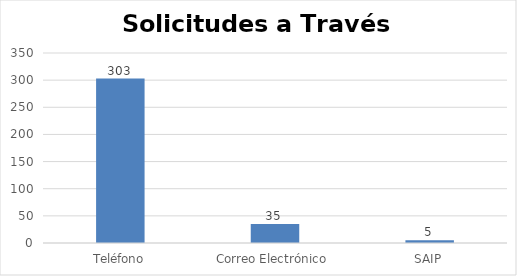
| Category | Cant. |
|---|---|
| Teléfono | 303 |
| Correo Electrónico  | 35 |
| SAIP | 5 |